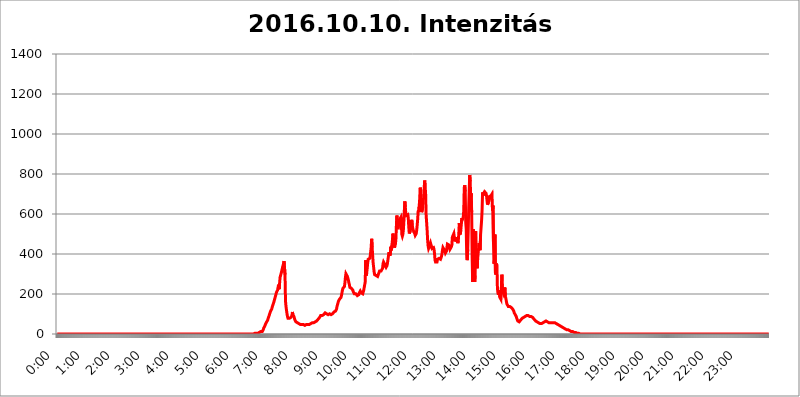
| Category | 2016.10.10. Intenzitás [W/m^2] |
|---|---|
| 0.0 | 0 |
| 0.0006944444444444445 | 0 |
| 0.001388888888888889 | 0 |
| 0.0020833333333333333 | 0 |
| 0.002777777777777778 | 0 |
| 0.003472222222222222 | 0 |
| 0.004166666666666667 | 0 |
| 0.004861111111111111 | 0 |
| 0.005555555555555556 | 0 |
| 0.0062499999999999995 | 0 |
| 0.006944444444444444 | 0 |
| 0.007638888888888889 | 0 |
| 0.008333333333333333 | 0 |
| 0.009027777777777779 | 0 |
| 0.009722222222222222 | 0 |
| 0.010416666666666666 | 0 |
| 0.011111111111111112 | 0 |
| 0.011805555555555555 | 0 |
| 0.012499999999999999 | 0 |
| 0.013194444444444444 | 0 |
| 0.013888888888888888 | 0 |
| 0.014583333333333332 | 0 |
| 0.015277777777777777 | 0 |
| 0.015972222222222224 | 0 |
| 0.016666666666666666 | 0 |
| 0.017361111111111112 | 0 |
| 0.018055555555555557 | 0 |
| 0.01875 | 0 |
| 0.019444444444444445 | 0 |
| 0.02013888888888889 | 0 |
| 0.020833333333333332 | 0 |
| 0.02152777777777778 | 0 |
| 0.022222222222222223 | 0 |
| 0.02291666666666667 | 0 |
| 0.02361111111111111 | 0 |
| 0.024305555555555556 | 0 |
| 0.024999999999999998 | 0 |
| 0.025694444444444447 | 0 |
| 0.02638888888888889 | 0 |
| 0.027083333333333334 | 0 |
| 0.027777777777777776 | 0 |
| 0.02847222222222222 | 0 |
| 0.029166666666666664 | 0 |
| 0.029861111111111113 | 0 |
| 0.030555555555555555 | 0 |
| 0.03125 | 0 |
| 0.03194444444444445 | 0 |
| 0.03263888888888889 | 0 |
| 0.03333333333333333 | 0 |
| 0.034027777777777775 | 0 |
| 0.034722222222222224 | 0 |
| 0.035416666666666666 | 0 |
| 0.036111111111111115 | 0 |
| 0.03680555555555556 | 0 |
| 0.0375 | 0 |
| 0.03819444444444444 | 0 |
| 0.03888888888888889 | 0 |
| 0.03958333333333333 | 0 |
| 0.04027777777777778 | 0 |
| 0.04097222222222222 | 0 |
| 0.041666666666666664 | 0 |
| 0.042361111111111106 | 0 |
| 0.04305555555555556 | 0 |
| 0.043750000000000004 | 0 |
| 0.044444444444444446 | 0 |
| 0.04513888888888889 | 0 |
| 0.04583333333333334 | 0 |
| 0.04652777777777778 | 0 |
| 0.04722222222222222 | 0 |
| 0.04791666666666666 | 0 |
| 0.04861111111111111 | 0 |
| 0.049305555555555554 | 0 |
| 0.049999999999999996 | 0 |
| 0.05069444444444445 | 0 |
| 0.051388888888888894 | 0 |
| 0.052083333333333336 | 0 |
| 0.05277777777777778 | 0 |
| 0.05347222222222222 | 0 |
| 0.05416666666666667 | 0 |
| 0.05486111111111111 | 0 |
| 0.05555555555555555 | 0 |
| 0.05625 | 0 |
| 0.05694444444444444 | 0 |
| 0.057638888888888885 | 0 |
| 0.05833333333333333 | 0 |
| 0.05902777777777778 | 0 |
| 0.059722222222222225 | 0 |
| 0.06041666666666667 | 0 |
| 0.061111111111111116 | 0 |
| 0.06180555555555556 | 0 |
| 0.0625 | 0 |
| 0.06319444444444444 | 0 |
| 0.06388888888888888 | 0 |
| 0.06458333333333334 | 0 |
| 0.06527777777777778 | 0 |
| 0.06597222222222222 | 0 |
| 0.06666666666666667 | 0 |
| 0.06736111111111111 | 0 |
| 0.06805555555555555 | 0 |
| 0.06874999999999999 | 0 |
| 0.06944444444444443 | 0 |
| 0.07013888888888889 | 0 |
| 0.07083333333333333 | 0 |
| 0.07152777777777779 | 0 |
| 0.07222222222222223 | 0 |
| 0.07291666666666667 | 0 |
| 0.07361111111111111 | 0 |
| 0.07430555555555556 | 0 |
| 0.075 | 0 |
| 0.07569444444444444 | 0 |
| 0.0763888888888889 | 0 |
| 0.07708333333333334 | 0 |
| 0.07777777777777778 | 0 |
| 0.07847222222222222 | 0 |
| 0.07916666666666666 | 0 |
| 0.0798611111111111 | 0 |
| 0.08055555555555556 | 0 |
| 0.08125 | 0 |
| 0.08194444444444444 | 0 |
| 0.08263888888888889 | 0 |
| 0.08333333333333333 | 0 |
| 0.08402777777777777 | 0 |
| 0.08472222222222221 | 0 |
| 0.08541666666666665 | 0 |
| 0.08611111111111112 | 0 |
| 0.08680555555555557 | 0 |
| 0.08750000000000001 | 0 |
| 0.08819444444444445 | 0 |
| 0.08888888888888889 | 0 |
| 0.08958333333333333 | 0 |
| 0.09027777777777778 | 0 |
| 0.09097222222222222 | 0 |
| 0.09166666666666667 | 0 |
| 0.09236111111111112 | 0 |
| 0.09305555555555556 | 0 |
| 0.09375 | 0 |
| 0.09444444444444444 | 0 |
| 0.09513888888888888 | 0 |
| 0.09583333333333333 | 0 |
| 0.09652777777777777 | 0 |
| 0.09722222222222222 | 0 |
| 0.09791666666666667 | 0 |
| 0.09861111111111111 | 0 |
| 0.09930555555555555 | 0 |
| 0.09999999999999999 | 0 |
| 0.10069444444444443 | 0 |
| 0.1013888888888889 | 0 |
| 0.10208333333333335 | 0 |
| 0.10277777777777779 | 0 |
| 0.10347222222222223 | 0 |
| 0.10416666666666667 | 0 |
| 0.10486111111111111 | 0 |
| 0.10555555555555556 | 0 |
| 0.10625 | 0 |
| 0.10694444444444444 | 0 |
| 0.1076388888888889 | 0 |
| 0.10833333333333334 | 0 |
| 0.10902777777777778 | 0 |
| 0.10972222222222222 | 0 |
| 0.1111111111111111 | 0 |
| 0.11180555555555556 | 0 |
| 0.11180555555555556 | 0 |
| 0.1125 | 0 |
| 0.11319444444444444 | 0 |
| 0.11388888888888889 | 0 |
| 0.11458333333333333 | 0 |
| 0.11527777777777777 | 0 |
| 0.11597222222222221 | 0 |
| 0.11666666666666665 | 0 |
| 0.1173611111111111 | 0 |
| 0.11805555555555557 | 0 |
| 0.11944444444444445 | 0 |
| 0.12013888888888889 | 0 |
| 0.12083333333333333 | 0 |
| 0.12152777777777778 | 0 |
| 0.12222222222222223 | 0 |
| 0.12291666666666667 | 0 |
| 0.12291666666666667 | 0 |
| 0.12361111111111112 | 0 |
| 0.12430555555555556 | 0 |
| 0.125 | 0 |
| 0.12569444444444444 | 0 |
| 0.12638888888888888 | 0 |
| 0.12708333333333333 | 0 |
| 0.16875 | 0 |
| 0.12847222222222224 | 0 |
| 0.12916666666666668 | 0 |
| 0.12986111111111112 | 0 |
| 0.13055555555555556 | 0 |
| 0.13125 | 0 |
| 0.13194444444444445 | 0 |
| 0.1326388888888889 | 0 |
| 0.13333333333333333 | 0 |
| 0.13402777777777777 | 0 |
| 0.13402777777777777 | 0 |
| 0.13472222222222222 | 0 |
| 0.13541666666666666 | 0 |
| 0.1361111111111111 | 0 |
| 0.13749999999999998 | 0 |
| 0.13819444444444443 | 0 |
| 0.1388888888888889 | 0 |
| 0.13958333333333334 | 0 |
| 0.14027777777777778 | 0 |
| 0.14097222222222222 | 0 |
| 0.14166666666666666 | 0 |
| 0.1423611111111111 | 0 |
| 0.14305555555555557 | 0 |
| 0.14375000000000002 | 0 |
| 0.14444444444444446 | 0 |
| 0.1451388888888889 | 0 |
| 0.1451388888888889 | 0 |
| 0.14652777777777778 | 0 |
| 0.14722222222222223 | 0 |
| 0.14791666666666667 | 0 |
| 0.1486111111111111 | 0 |
| 0.14930555555555555 | 0 |
| 0.15 | 0 |
| 0.15069444444444444 | 0 |
| 0.15138888888888888 | 0 |
| 0.15208333333333332 | 0 |
| 0.15277777777777776 | 0 |
| 0.15347222222222223 | 0 |
| 0.15416666666666667 | 0 |
| 0.15486111111111112 | 0 |
| 0.15555555555555556 | 0 |
| 0.15625 | 0 |
| 0.15694444444444444 | 0 |
| 0.15763888888888888 | 0 |
| 0.15833333333333333 | 0 |
| 0.15902777777777777 | 0 |
| 0.15972222222222224 | 0 |
| 0.16041666666666668 | 0 |
| 0.16111111111111112 | 0 |
| 0.16180555555555556 | 0 |
| 0.1625 | 0 |
| 0.16319444444444445 | 0 |
| 0.1638888888888889 | 0 |
| 0.16458333333333333 | 0 |
| 0.16527777777777777 | 0 |
| 0.16597222222222222 | 0 |
| 0.16666666666666666 | 0 |
| 0.1673611111111111 | 0 |
| 0.16805555555555554 | 0 |
| 0.16874999999999998 | 0 |
| 0.16944444444444443 | 0 |
| 0.17013888888888887 | 0 |
| 0.1708333333333333 | 0 |
| 0.17152777777777775 | 0 |
| 0.17222222222222225 | 0 |
| 0.1729166666666667 | 0 |
| 0.17361111111111113 | 0 |
| 0.17430555555555557 | 0 |
| 0.17500000000000002 | 0 |
| 0.17569444444444446 | 0 |
| 0.1763888888888889 | 0 |
| 0.17708333333333334 | 0 |
| 0.17777777777777778 | 0 |
| 0.17847222222222223 | 0 |
| 0.17916666666666667 | 0 |
| 0.1798611111111111 | 0 |
| 0.18055555555555555 | 0 |
| 0.18125 | 0 |
| 0.18194444444444444 | 0 |
| 0.1826388888888889 | 0 |
| 0.18333333333333335 | 0 |
| 0.1840277777777778 | 0 |
| 0.18472222222222223 | 0 |
| 0.18541666666666667 | 0 |
| 0.18611111111111112 | 0 |
| 0.18680555555555556 | 0 |
| 0.1875 | 0 |
| 0.18819444444444444 | 0 |
| 0.18888888888888888 | 0 |
| 0.18958333333333333 | 0 |
| 0.19027777777777777 | 0 |
| 0.1909722222222222 | 0 |
| 0.19166666666666665 | 0 |
| 0.19236111111111112 | 0 |
| 0.19305555555555554 | 0 |
| 0.19375 | 0 |
| 0.19444444444444445 | 0 |
| 0.1951388888888889 | 0 |
| 0.19583333333333333 | 0 |
| 0.19652777777777777 | 0 |
| 0.19722222222222222 | 0 |
| 0.19791666666666666 | 0 |
| 0.1986111111111111 | 0 |
| 0.19930555555555554 | 0 |
| 0.19999999999999998 | 0 |
| 0.20069444444444443 | 0 |
| 0.20138888888888887 | 0 |
| 0.2020833333333333 | 0 |
| 0.2027777777777778 | 0 |
| 0.2034722222222222 | 0 |
| 0.2041666666666667 | 0 |
| 0.20486111111111113 | 0 |
| 0.20555555555555557 | 0 |
| 0.20625000000000002 | 0 |
| 0.20694444444444446 | 0 |
| 0.2076388888888889 | 0 |
| 0.20833333333333334 | 0 |
| 0.20902777777777778 | 0 |
| 0.20972222222222223 | 0 |
| 0.21041666666666667 | 0 |
| 0.2111111111111111 | 0 |
| 0.21180555555555555 | 0 |
| 0.2125 | 0 |
| 0.21319444444444444 | 0 |
| 0.2138888888888889 | 0 |
| 0.21458333333333335 | 0 |
| 0.2152777777777778 | 0 |
| 0.21597222222222223 | 0 |
| 0.21666666666666667 | 0 |
| 0.21736111111111112 | 0 |
| 0.21805555555555556 | 0 |
| 0.21875 | 0 |
| 0.21944444444444444 | 0 |
| 0.22013888888888888 | 0 |
| 0.22083333333333333 | 0 |
| 0.22152777777777777 | 0 |
| 0.2222222222222222 | 0 |
| 0.22291666666666665 | 0 |
| 0.2236111111111111 | 0 |
| 0.22430555555555556 | 0 |
| 0.225 | 0 |
| 0.22569444444444445 | 0 |
| 0.2263888888888889 | 0 |
| 0.22708333333333333 | 0 |
| 0.22777777777777777 | 0 |
| 0.22847222222222222 | 0 |
| 0.22916666666666666 | 0 |
| 0.2298611111111111 | 0 |
| 0.23055555555555554 | 0 |
| 0.23124999999999998 | 0 |
| 0.23194444444444443 | 0 |
| 0.23263888888888887 | 0 |
| 0.2333333333333333 | 0 |
| 0.2340277777777778 | 0 |
| 0.2347222222222222 | 0 |
| 0.2354166666666667 | 0 |
| 0.23611111111111113 | 0 |
| 0.23680555555555557 | 0 |
| 0.23750000000000002 | 0 |
| 0.23819444444444446 | 0 |
| 0.2388888888888889 | 0 |
| 0.23958333333333334 | 0 |
| 0.24027777777777778 | 0 |
| 0.24097222222222223 | 0 |
| 0.24166666666666667 | 0 |
| 0.2423611111111111 | 0 |
| 0.24305555555555555 | 0 |
| 0.24375 | 0 |
| 0.24444444444444446 | 0 |
| 0.24513888888888888 | 0 |
| 0.24583333333333335 | 0 |
| 0.2465277777777778 | 0 |
| 0.24722222222222223 | 0 |
| 0.24791666666666667 | 0 |
| 0.24861111111111112 | 0 |
| 0.24930555555555556 | 0 |
| 0.25 | 0 |
| 0.25069444444444444 | 0 |
| 0.2513888888888889 | 0 |
| 0.2520833333333333 | 0 |
| 0.25277777777777777 | 0 |
| 0.2534722222222222 | 0 |
| 0.25416666666666665 | 0 |
| 0.2548611111111111 | 0 |
| 0.2555555555555556 | 0 |
| 0.25625000000000003 | 0 |
| 0.2569444444444445 | 0 |
| 0.2576388888888889 | 0 |
| 0.25833333333333336 | 0 |
| 0.2590277777777778 | 0 |
| 0.25972222222222224 | 0 |
| 0.2604166666666667 | 0 |
| 0.2611111111111111 | 0 |
| 0.26180555555555557 | 0 |
| 0.2625 | 0 |
| 0.26319444444444445 | 0 |
| 0.2638888888888889 | 0 |
| 0.26458333333333334 | 0 |
| 0.2652777777777778 | 0 |
| 0.2659722222222222 | 0 |
| 0.26666666666666666 | 0 |
| 0.2673611111111111 | 0 |
| 0.26805555555555555 | 0 |
| 0.26875 | 0 |
| 0.26944444444444443 | 0 |
| 0.2701388888888889 | 0 |
| 0.2708333333333333 | 0 |
| 0.27152777777777776 | 0 |
| 0.2722222222222222 | 0 |
| 0.27291666666666664 | 0 |
| 0.2736111111111111 | 0 |
| 0.2743055555555555 | 0 |
| 0.27499999999999997 | 0 |
| 0.27569444444444446 | 3.525 |
| 0.27638888888888885 | 3.525 |
| 0.27708333333333335 | 3.525 |
| 0.2777777777777778 | 3.525 |
| 0.27847222222222223 | 3.525 |
| 0.2791666666666667 | 3.525 |
| 0.2798611111111111 | 3.525 |
| 0.28055555555555556 | 3.525 |
| 0.28125 | 3.525 |
| 0.28194444444444444 | 7.887 |
| 0.2826388888888889 | 7.887 |
| 0.2833333333333333 | 7.887 |
| 0.28402777777777777 | 12.257 |
| 0.2847222222222222 | 12.257 |
| 0.28541666666666665 | 12.257 |
| 0.28611111111111115 | 12.257 |
| 0.28680555555555554 | 12.257 |
| 0.28750000000000003 | 12.257 |
| 0.2881944444444445 | 16.636 |
| 0.2888888888888889 | 21.024 |
| 0.28958333333333336 | 29.823 |
| 0.2902777777777778 | 34.234 |
| 0.29097222222222224 | 38.653 |
| 0.2916666666666667 | 43.079 |
| 0.2923611111111111 | 51.951 |
| 0.29305555555555557 | 56.398 |
| 0.29375 | 60.85 |
| 0.29444444444444445 | 65.31 |
| 0.2951388888888889 | 69.775 |
| 0.29583333333333334 | 78.722 |
| 0.2965277777777778 | 83.205 |
| 0.2972222222222222 | 92.184 |
| 0.29791666666666666 | 101.184 |
| 0.2986111111111111 | 105.69 |
| 0.29930555555555555 | 114.716 |
| 0.3 | 119.235 |
| 0.30069444444444443 | 123.758 |
| 0.3013888888888889 | 132.814 |
| 0.3020833333333333 | 141.884 |
| 0.30277777777777776 | 146.423 |
| 0.3034722222222222 | 155.509 |
| 0.30416666666666664 | 164.605 |
| 0.3048611111111111 | 173.709 |
| 0.3055555555555555 | 182.82 |
| 0.30624999999999997 | 191.937 |
| 0.3069444444444444 | 201.058 |
| 0.3076388888888889 | 210.182 |
| 0.30833333333333335 | 214.746 |
| 0.3090277777777778 | 219.309 |
| 0.30972222222222223 | 233 |
| 0.3104166666666667 | 246.689 |
| 0.3111111111111111 | 223.873 |
| 0.31180555555555556 | 251.251 |
| 0.3125 | 283.156 |
| 0.31319444444444444 | 292.259 |
| 0.3138888888888889 | 301.354 |
| 0.3145833333333333 | 310.44 |
| 0.31527777777777777 | 314.98 |
| 0.3159722222222222 | 333.113 |
| 0.31666666666666665 | 342.162 |
| 0.31736111111111115 | 351.198 |
| 0.31805555555555554 | 364.728 |
| 0.31875000000000003 | 360.221 |
| 0.3194444444444445 | 296.808 |
| 0.3201388888888889 | 164.605 |
| 0.32083333333333336 | 137.347 |
| 0.3215277777777778 | 141.884 |
| 0.32222222222222224 | 101.184 |
| 0.3229166666666667 | 87.692 |
| 0.3236111111111111 | 78.722 |
| 0.32430555555555557 | 78.722 |
| 0.325 | 78.722 |
| 0.32569444444444445 | 78.722 |
| 0.3263888888888889 | 78.722 |
| 0.32708333333333334 | 83.205 |
| 0.3277777777777778 | 83.205 |
| 0.3284722222222222 | 87.692 |
| 0.32916666666666666 | 92.184 |
| 0.3298611111111111 | 110.201 |
| 0.33055555555555555 | 96.682 |
| 0.33125 | 101.184 |
| 0.33194444444444443 | 87.692 |
| 0.3326388888888889 | 78.722 |
| 0.3333333333333333 | 69.775 |
| 0.3340277777777778 | 65.31 |
| 0.3347222222222222 | 60.85 |
| 0.3354166666666667 | 60.85 |
| 0.3361111111111111 | 60.85 |
| 0.3368055555555556 | 56.398 |
| 0.33749999999999997 | 56.398 |
| 0.33819444444444446 | 56.398 |
| 0.33888888888888885 | 51.951 |
| 0.33958333333333335 | 51.951 |
| 0.34027777777777773 | 47.511 |
| 0.34097222222222223 | 47.511 |
| 0.3416666666666666 | 47.511 |
| 0.3423611111111111 | 47.511 |
| 0.3430555555555555 | 47.511 |
| 0.34375 | 47.511 |
| 0.3444444444444445 | 47.511 |
| 0.3451388888888889 | 47.511 |
| 0.3458333333333334 | 47.511 |
| 0.34652777777777777 | 47.511 |
| 0.34722222222222227 | 43.079 |
| 0.34791666666666665 | 43.079 |
| 0.34861111111111115 | 43.079 |
| 0.34930555555555554 | 47.511 |
| 0.35000000000000003 | 47.511 |
| 0.3506944444444444 | 47.511 |
| 0.3513888888888889 | 47.511 |
| 0.3520833333333333 | 47.511 |
| 0.3527777777777778 | 47.511 |
| 0.3534722222222222 | 47.511 |
| 0.3541666666666667 | 47.511 |
| 0.3548611111111111 | 51.951 |
| 0.35555555555555557 | 51.951 |
| 0.35625 | 51.951 |
| 0.35694444444444445 | 51.951 |
| 0.3576388888888889 | 56.398 |
| 0.35833333333333334 | 56.398 |
| 0.3590277777777778 | 56.398 |
| 0.3597222222222222 | 56.398 |
| 0.36041666666666666 | 56.398 |
| 0.3611111111111111 | 60.85 |
| 0.36180555555555555 | 60.85 |
| 0.3625 | 60.85 |
| 0.36319444444444443 | 65.31 |
| 0.3638888888888889 | 65.31 |
| 0.3645833333333333 | 65.31 |
| 0.3652777777777778 | 69.775 |
| 0.3659722222222222 | 74.246 |
| 0.3666666666666667 | 74.246 |
| 0.3673611111111111 | 78.722 |
| 0.3680555555555556 | 83.205 |
| 0.36874999999999997 | 87.692 |
| 0.36944444444444446 | 92.184 |
| 0.37013888888888885 | 92.184 |
| 0.37083333333333335 | 92.184 |
| 0.37152777777777773 | 92.184 |
| 0.37222222222222223 | 96.682 |
| 0.3729166666666666 | 96.682 |
| 0.3736111111111111 | 96.682 |
| 0.3743055555555555 | 101.184 |
| 0.375 | 101.184 |
| 0.3756944444444445 | 105.69 |
| 0.3763888888888889 | 101.184 |
| 0.3770833333333334 | 101.184 |
| 0.37777777777777777 | 101.184 |
| 0.37847222222222227 | 96.682 |
| 0.37916666666666665 | 96.682 |
| 0.37986111111111115 | 96.682 |
| 0.38055555555555554 | 101.184 |
| 0.38125000000000003 | 101.184 |
| 0.3819444444444444 | 101.184 |
| 0.3826388888888889 | 101.184 |
| 0.3833333333333333 | 101.184 |
| 0.3840277777777778 | 96.682 |
| 0.3847222222222222 | 96.682 |
| 0.3854166666666667 | 96.682 |
| 0.3861111111111111 | 101.184 |
| 0.38680555555555557 | 101.184 |
| 0.3875 | 105.69 |
| 0.38819444444444445 | 110.201 |
| 0.3888888888888889 | 110.201 |
| 0.38958333333333334 | 110.201 |
| 0.3902777777777778 | 114.716 |
| 0.3909722222222222 | 119.235 |
| 0.39166666666666666 | 123.758 |
| 0.3923611111111111 | 137.347 |
| 0.39305555555555555 | 146.423 |
| 0.39375 | 155.509 |
| 0.39444444444444443 | 164.605 |
| 0.3951388888888889 | 169.156 |
| 0.3958333333333333 | 173.709 |
| 0.3965277777777778 | 173.709 |
| 0.3972222222222222 | 173.709 |
| 0.3979166666666667 | 182.82 |
| 0.3986111111111111 | 191.937 |
| 0.3993055555555556 | 205.62 |
| 0.39999999999999997 | 219.309 |
| 0.40069444444444446 | 228.436 |
| 0.40138888888888885 | 228.436 |
| 0.40208333333333335 | 228.436 |
| 0.40277777777777773 | 237.564 |
| 0.40347222222222223 | 255.813 |
| 0.4041666666666666 | 283.156 |
| 0.4048611111111111 | 301.354 |
| 0.4055555555555555 | 305.898 |
| 0.40625 | 296.808 |
| 0.4069444444444445 | 287.709 |
| 0.4076388888888889 | 278.603 |
| 0.4083333333333334 | 269.49 |
| 0.40902777777777777 | 255.813 |
| 0.40972222222222227 | 246.689 |
| 0.41041666666666665 | 233 |
| 0.41111111111111115 | 228.436 |
| 0.41180555555555554 | 228.436 |
| 0.41250000000000003 | 228.436 |
| 0.4131944444444444 | 228.436 |
| 0.4138888888888889 | 223.873 |
| 0.4145833333333333 | 219.309 |
| 0.4152777777777778 | 210.182 |
| 0.4159722222222222 | 205.62 |
| 0.4166666666666667 | 201.058 |
| 0.4173611111111111 | 201.058 |
| 0.41805555555555557 | 201.058 |
| 0.41875 | 201.058 |
| 0.41944444444444445 | 201.058 |
| 0.4201388888888889 | 196.497 |
| 0.42083333333333334 | 191.937 |
| 0.4215277777777778 | 191.937 |
| 0.4222222222222222 | 191.937 |
| 0.42291666666666666 | 196.497 |
| 0.4236111111111111 | 205.62 |
| 0.42430555555555555 | 210.182 |
| 0.425 | 214.746 |
| 0.42569444444444443 | 210.182 |
| 0.4263888888888889 | 205.62 |
| 0.4270833333333333 | 201.058 |
| 0.4277777777777778 | 201.058 |
| 0.4284722222222222 | 201.058 |
| 0.4291666666666667 | 210.182 |
| 0.4298611111111111 | 219.309 |
| 0.4305555555555556 | 233 |
| 0.43124999999999997 | 246.689 |
| 0.43194444444444446 | 260.373 |
| 0.43263888888888885 | 369.23 |
| 0.43333333333333335 | 292.259 |
| 0.43402777777777773 | 305.898 |
| 0.43472222222222223 | 328.584 |
| 0.4354166666666666 | 355.712 |
| 0.4361111111111111 | 373.729 |
| 0.4368055555555555 | 378.224 |
| 0.4375 | 373.729 |
| 0.4381944444444445 | 378.224 |
| 0.4388888888888889 | 387.202 |
| 0.4395833333333334 | 409.574 |
| 0.44027777777777777 | 431.833 |
| 0.44097222222222227 | 475.972 |
| 0.44166666666666665 | 436.27 |
| 0.44236111111111115 | 391.685 |
| 0.44305555555555554 | 355.712 |
| 0.44375000000000003 | 333.113 |
| 0.4444444444444444 | 310.44 |
| 0.4451388888888889 | 296.808 |
| 0.4458333333333333 | 292.259 |
| 0.4465277777777778 | 292.259 |
| 0.4472222222222222 | 292.259 |
| 0.4479166666666667 | 292.259 |
| 0.4486111111111111 | 287.709 |
| 0.44930555555555557 | 287.709 |
| 0.45 | 292.259 |
| 0.45069444444444445 | 301.354 |
| 0.4513888888888889 | 305.898 |
| 0.45208333333333334 | 314.98 |
| 0.4527777777777778 | 319.517 |
| 0.4534722222222222 | 319.517 |
| 0.45416666666666666 | 314.98 |
| 0.4548611111111111 | 310.44 |
| 0.45555555555555555 | 314.98 |
| 0.45625 | 328.584 |
| 0.45694444444444443 | 351.198 |
| 0.4576388888888889 | 360.221 |
| 0.4583333333333333 | 360.221 |
| 0.4590277777777778 | 351.198 |
| 0.4597222222222222 | 342.162 |
| 0.4604166666666667 | 337.639 |
| 0.4611111111111111 | 333.113 |
| 0.4618055555555556 | 333.113 |
| 0.46249999999999997 | 342.162 |
| 0.46319444444444446 | 355.712 |
| 0.46388888888888885 | 373.729 |
| 0.46458333333333335 | 391.685 |
| 0.46527777777777773 | 409.574 |
| 0.46597222222222223 | 405.108 |
| 0.4666666666666666 | 391.685 |
| 0.4673611111111111 | 387.202 |
| 0.4680555555555555 | 436.27 |
| 0.46875 | 418.492 |
| 0.4694444444444445 | 445.129 |
| 0.4701388888888889 | 471.582 |
| 0.4708333333333334 | 502.192 |
| 0.47152777777777777 | 506.542 |
| 0.47222222222222227 | 453.968 |
| 0.47291666666666665 | 431.833 |
| 0.47361111111111115 | 440.702 |
| 0.47430555555555554 | 449.551 |
| 0.47500000000000003 | 475.972 |
| 0.4756944444444444 | 545.416 |
| 0.4763888888888889 | 592.233 |
| 0.4770833333333333 | 532.513 |
| 0.4777777777777778 | 523.88 |
| 0.4784722222222222 | 519.555 |
| 0.4791666666666667 | 523.88 |
| 0.4798611111111111 | 571.049 |
| 0.48055555555555557 | 571.049 |
| 0.48125 | 566.793 |
| 0.48194444444444445 | 583.779 |
| 0.4826388888888889 | 541.121 |
| 0.48333333333333334 | 497.836 |
| 0.4840277777777778 | 489.108 |
| 0.4847222222222222 | 497.836 |
| 0.48541666666666666 | 519.555 |
| 0.4861111111111111 | 558.261 |
| 0.48680555555555555 | 617.436 |
| 0.4875 | 663.019 |
| 0.48819444444444443 | 634.105 |
| 0.4888888888888889 | 600.661 |
| 0.4895833333333333 | 592.233 |
| 0.4902777777777778 | 596.45 |
| 0.4909722222222222 | 592.233 |
| 0.4916666666666667 | 596.45 |
| 0.4923611111111111 | 579.542 |
| 0.4930555555555556 | 532.513 |
| 0.49374999999999997 | 502.192 |
| 0.49444444444444446 | 502.192 |
| 0.49513888888888885 | 515.223 |
| 0.49583333333333335 | 532.513 |
| 0.49652777777777773 | 553.986 |
| 0.49722222222222223 | 571.049 |
| 0.4979166666666666 | 545.416 |
| 0.4986111111111111 | 528.2 |
| 0.4993055555555555 | 519.555 |
| 0.5 | 510.885 |
| 0.5006944444444444 | 510.885 |
| 0.5013888888888889 | 502.192 |
| 0.5020833333333333 | 493.475 |
| 0.5027777777777778 | 489.108 |
| 0.5034722222222222 | 502.192 |
| 0.5041666666666667 | 519.555 |
| 0.5048611111111111 | 545.416 |
| 0.5055555555555555 | 575.299 |
| 0.50625 | 617.436 |
| 0.5069444444444444 | 609.062 |
| 0.5076388888888889 | 638.256 |
| 0.5083333333333333 | 675.311 |
| 0.5090277777777777 | 731.896 |
| 0.5097222222222222 | 719.877 |
| 0.5104166666666666 | 663.019 |
| 0.5111111111111112 | 609.062 |
| 0.5118055555555555 | 604.864 |
| 0.5125000000000001 | 629.948 |
| 0.5131944444444444 | 671.22 |
| 0.513888888888889 | 679.395 |
| 0.5145833333333333 | 683.473 |
| 0.5152777777777778 | 767.62 |
| 0.5159722222222222 | 739.877 |
| 0.5166666666666667 | 699.717 |
| 0.517361111111111 | 596.45 |
| 0.5180555555555556 | 558.261 |
| 0.5187499999999999 | 519.555 |
| 0.5194444444444445 | 471.582 |
| 0.5201388888888888 | 440.702 |
| 0.5208333333333334 | 427.39 |
| 0.5215277777777778 | 422.943 |
| 0.5222222222222223 | 431.833 |
| 0.5229166666666667 | 445.129 |
| 0.5236111111111111 | 453.968 |
| 0.5243055555555556 | 458.38 |
| 0.525 | 436.27 |
| 0.5256944444444445 | 427.39 |
| 0.5263888888888889 | 422.943 |
| 0.5270833333333333 | 427.39 |
| 0.5277777777777778 | 431.833 |
| 0.5284722222222222 | 422.943 |
| 0.5291666666666667 | 400.638 |
| 0.5298611111111111 | 369.23 |
| 0.5305555555555556 | 360.221 |
| 0.53125 | 355.712 |
| 0.5319444444444444 | 355.712 |
| 0.5326388888888889 | 360.221 |
| 0.5333333333333333 | 373.729 |
| 0.5340277777777778 | 373.729 |
| 0.5347222222222222 | 378.224 |
| 0.5354166666666667 | 378.224 |
| 0.5361111111111111 | 378.224 |
| 0.5368055555555555 | 373.729 |
| 0.5375 | 373.729 |
| 0.5381944444444444 | 378.224 |
| 0.5388888888888889 | 387.202 |
| 0.5395833333333333 | 400.638 |
| 0.5402777777777777 | 418.492 |
| 0.5409722222222222 | 431.833 |
| 0.5416666666666666 | 431.833 |
| 0.5423611111111112 | 422.943 |
| 0.5430555555555555 | 418.492 |
| 0.5437500000000001 | 414.035 |
| 0.5444444444444444 | 405.108 |
| 0.545138888888889 | 405.108 |
| 0.5458333333333333 | 414.035 |
| 0.5465277777777778 | 431.833 |
| 0.5472222222222222 | 449.551 |
| 0.5479166666666667 | 453.968 |
| 0.548611111111111 | 449.551 |
| 0.5493055555555556 | 445.129 |
| 0.5499999999999999 | 431.833 |
| 0.5506944444444445 | 422.943 |
| 0.5513888888888888 | 422.943 |
| 0.5520833333333334 | 427.39 |
| 0.5527777777777778 | 436.27 |
| 0.5534722222222223 | 445.129 |
| 0.5541666666666667 | 484.735 |
| 0.5548611111111111 | 484.735 |
| 0.5555555555555556 | 484.735 |
| 0.55625 | 502.192 |
| 0.5569444444444445 | 502.192 |
| 0.5576388888888889 | 462.786 |
| 0.5583333333333333 | 462.786 |
| 0.5590277777777778 | 475.972 |
| 0.5597222222222222 | 484.735 |
| 0.5604166666666667 | 471.582 |
| 0.5611111111111111 | 462.786 |
| 0.5618055555555556 | 453.968 |
| 0.5625 | 467.187 |
| 0.5631944444444444 | 502.192 |
| 0.5638888888888889 | 553.986 |
| 0.5645833333333333 | 558.261 |
| 0.5652777777777778 | 497.836 |
| 0.5659722222222222 | 519.555 |
| 0.5666666666666667 | 545.416 |
| 0.5673611111111111 | 579.542 |
| 0.5680555555555555 | 571.049 |
| 0.56875 | 575.299 |
| 0.5694444444444444 | 583.779 |
| 0.5701388888888889 | 617.436 |
| 0.5708333333333333 | 731.896 |
| 0.5715277777777777 | 743.859 |
| 0.5722222222222222 | 711.832 |
| 0.5729166666666666 | 558.261 |
| 0.5736111111111112 | 523.88 |
| 0.5743055555555555 | 391.685 |
| 0.5750000000000001 | 369.23 |
| 0.5756944444444444 | 422.943 |
| 0.576388888888889 | 515.223 |
| 0.5770833333333333 | 629.948 |
| 0.5777777777777778 | 634.105 |
| 0.5784722222222222 | 795.074 |
| 0.5791666666666667 | 763.674 |
| 0.579861111111111 | 687.544 |
| 0.5805555555555556 | 703.762 |
| 0.5812499999999999 | 609.062 |
| 0.5819444444444445 | 378.224 |
| 0.5826388888888888 | 260.373 |
| 0.5833333333333334 | 523.88 |
| 0.5840277777777778 | 369.23 |
| 0.5847222222222223 | 414.035 |
| 0.5854166666666667 | 260.373 |
| 0.5861111111111111 | 292.259 |
| 0.5868055555555556 | 515.223 |
| 0.5875 | 360.221 |
| 0.5881944444444445 | 391.685 |
| 0.5888888888888889 | 328.584 |
| 0.5895833333333333 | 369.23 |
| 0.5902777777777778 | 405.108 |
| 0.5909722222222222 | 427.39 |
| 0.5916666666666667 | 453.968 |
| 0.5923611111111111 | 427.39 |
| 0.5930555555555556 | 418.492 |
| 0.59375 | 497.836 |
| 0.5944444444444444 | 497.836 |
| 0.5951388888888889 | 566.793 |
| 0.5958333333333333 | 617.436 |
| 0.5965277777777778 | 707.8 |
| 0.5972222222222222 | 691.608 |
| 0.5979166666666667 | 703.762 |
| 0.5986111111111111 | 707.8 |
| 0.5993055555555555 | 711.832 |
| 0.6 | 707.8 |
| 0.6006944444444444 | 707.8 |
| 0.6013888888888889 | 703.762 |
| 0.6020833333333333 | 691.608 |
| 0.6027777777777777 | 667.123 |
| 0.6034722222222222 | 646.537 |
| 0.6041666666666666 | 650.667 |
| 0.6048611111111112 | 658.909 |
| 0.6055555555555555 | 667.123 |
| 0.6062500000000001 | 687.544 |
| 0.6069444444444444 | 691.608 |
| 0.607638888888889 | 691.608 |
| 0.6083333333333333 | 691.608 |
| 0.6090277777777778 | 695.666 |
| 0.6097222222222222 | 699.717 |
| 0.6104166666666667 | 617.436 |
| 0.611111111111111 | 642.4 |
| 0.6118055555555556 | 462.786 |
| 0.6124999999999999 | 351.198 |
| 0.6131944444444445 | 369.23 |
| 0.6138888888888888 | 497.836 |
| 0.6145833333333334 | 305.898 |
| 0.6152777777777778 | 296.808 |
| 0.6159722222222223 | 351.198 |
| 0.6166666666666667 | 342.162 |
| 0.6173611111111111 | 228.436 |
| 0.6180555555555556 | 205.62 |
| 0.61875 | 196.497 |
| 0.6194444444444445 | 191.937 |
| 0.6201388888888889 | 219.309 |
| 0.6208333333333333 | 182.82 |
| 0.6215277777777778 | 182.82 |
| 0.6222222222222222 | 173.709 |
| 0.6229166666666667 | 178.264 |
| 0.6236111111111111 | 296.808 |
| 0.6243055555555556 | 205.62 |
| 0.625 | 214.746 |
| 0.6256944444444444 | 205.62 |
| 0.6263888888888889 | 210.182 |
| 0.6270833333333333 | 201.058 |
| 0.6277777777777778 | 233 |
| 0.6284722222222222 | 187.378 |
| 0.6291666666666667 | 178.264 |
| 0.6298611111111111 | 164.605 |
| 0.6305555555555555 | 150.964 |
| 0.63125 | 146.423 |
| 0.6319444444444444 | 146.423 |
| 0.6326388888888889 | 137.347 |
| 0.6333333333333333 | 141.884 |
| 0.6340277777777777 | 137.347 |
| 0.6347222222222222 | 137.347 |
| 0.6354166666666666 | 137.347 |
| 0.6361111111111112 | 137.347 |
| 0.6368055555555555 | 132.814 |
| 0.6375000000000001 | 128.284 |
| 0.6381944444444444 | 128.284 |
| 0.638888888888889 | 123.758 |
| 0.6395833333333333 | 119.235 |
| 0.6402777777777778 | 114.716 |
| 0.6409722222222222 | 105.69 |
| 0.6416666666666667 | 101.184 |
| 0.642361111111111 | 96.682 |
| 0.6430555555555556 | 92.184 |
| 0.6437499999999999 | 87.692 |
| 0.6444444444444445 | 78.722 |
| 0.6451388888888888 | 74.246 |
| 0.6458333333333334 | 65.31 |
| 0.6465277777777778 | 65.31 |
| 0.6472222222222223 | 60.85 |
| 0.6479166666666667 | 60.85 |
| 0.6486111111111111 | 65.31 |
| 0.6493055555555556 | 65.31 |
| 0.65 | 69.775 |
| 0.6506944444444445 | 74.246 |
| 0.6513888888888889 | 74.246 |
| 0.6520833333333333 | 78.722 |
| 0.6527777777777778 | 83.205 |
| 0.6534722222222222 | 83.205 |
| 0.6541666666666667 | 83.205 |
| 0.6548611111111111 | 87.692 |
| 0.6555555555555556 | 87.692 |
| 0.65625 | 87.692 |
| 0.6569444444444444 | 87.692 |
| 0.6576388888888889 | 92.184 |
| 0.6583333333333333 | 92.184 |
| 0.6590277777777778 | 92.184 |
| 0.6597222222222222 | 92.184 |
| 0.6604166666666667 | 92.184 |
| 0.6611111111111111 | 92.184 |
| 0.6618055555555555 | 87.692 |
| 0.6625 | 87.692 |
| 0.6631944444444444 | 87.692 |
| 0.6638888888888889 | 87.692 |
| 0.6645833333333333 | 87.692 |
| 0.6652777777777777 | 83.205 |
| 0.6659722222222222 | 83.205 |
| 0.6666666666666666 | 83.205 |
| 0.6673611111111111 | 83.205 |
| 0.6680555555555556 | 78.722 |
| 0.6687500000000001 | 74.246 |
| 0.6694444444444444 | 69.775 |
| 0.6701388888888888 | 69.775 |
| 0.6708333333333334 | 65.31 |
| 0.6715277777777778 | 65.31 |
| 0.6722222222222222 | 60.85 |
| 0.6729166666666666 | 60.85 |
| 0.6736111111111112 | 56.398 |
| 0.6743055555555556 | 56.398 |
| 0.6749999999999999 | 56.398 |
| 0.6756944444444444 | 51.951 |
| 0.6763888888888889 | 51.951 |
| 0.6770833333333334 | 51.951 |
| 0.6777777777777777 | 51.951 |
| 0.6784722222222223 | 51.951 |
| 0.6791666666666667 | 51.951 |
| 0.6798611111111111 | 51.951 |
| 0.6805555555555555 | 56.398 |
| 0.68125 | 56.398 |
| 0.6819444444444445 | 56.398 |
| 0.6826388888888889 | 60.85 |
| 0.6833333333333332 | 60.85 |
| 0.6840277777777778 | 65.31 |
| 0.6847222222222222 | 65.31 |
| 0.6854166666666667 | 65.31 |
| 0.686111111111111 | 65.31 |
| 0.6868055555555556 | 60.85 |
| 0.6875 | 60.85 |
| 0.6881944444444444 | 60.85 |
| 0.688888888888889 | 56.398 |
| 0.6895833333333333 | 56.398 |
| 0.6902777777777778 | 56.398 |
| 0.6909722222222222 | 56.398 |
| 0.6916666666666668 | 56.398 |
| 0.6923611111111111 | 56.398 |
| 0.6930555555555555 | 56.398 |
| 0.69375 | 56.398 |
| 0.6944444444444445 | 56.398 |
| 0.6951388888888889 | 56.398 |
| 0.6958333333333333 | 56.398 |
| 0.6965277777777777 | 56.398 |
| 0.6972222222222223 | 56.398 |
| 0.6979166666666666 | 56.398 |
| 0.6986111111111111 | 56.398 |
| 0.6993055555555556 | 51.951 |
| 0.7000000000000001 | 51.951 |
| 0.7006944444444444 | 51.951 |
| 0.7013888888888888 | 47.511 |
| 0.7020833333333334 | 47.511 |
| 0.7027777777777778 | 43.079 |
| 0.7034722222222222 | 43.079 |
| 0.7041666666666666 | 43.079 |
| 0.7048611111111112 | 38.653 |
| 0.7055555555555556 | 38.653 |
| 0.7062499999999999 | 38.653 |
| 0.7069444444444444 | 38.653 |
| 0.7076388888888889 | 34.234 |
| 0.7083333333333334 | 34.234 |
| 0.7090277777777777 | 34.234 |
| 0.7097222222222223 | 29.823 |
| 0.7104166666666667 | 29.823 |
| 0.7111111111111111 | 29.823 |
| 0.7118055555555555 | 25.419 |
| 0.7125 | 25.419 |
| 0.7131944444444445 | 25.419 |
| 0.7138888888888889 | 21.024 |
| 0.7145833333333332 | 21.024 |
| 0.7152777777777778 | 21.024 |
| 0.7159722222222222 | 21.024 |
| 0.7166666666666667 | 21.024 |
| 0.717361111111111 | 21.024 |
| 0.7180555555555556 | 16.636 |
| 0.71875 | 16.636 |
| 0.7194444444444444 | 16.636 |
| 0.720138888888889 | 16.636 |
| 0.7208333333333333 | 12.257 |
| 0.7215277777777778 | 12.257 |
| 0.7222222222222222 | 12.257 |
| 0.7229166666666668 | 12.257 |
| 0.7236111111111111 | 12.257 |
| 0.7243055555555555 | 12.257 |
| 0.725 | 7.887 |
| 0.7256944444444445 | 7.887 |
| 0.7263888888888889 | 7.887 |
| 0.7270833333333333 | 7.887 |
| 0.7277777777777777 | 7.887 |
| 0.7284722222222223 | 7.887 |
| 0.7291666666666666 | 3.525 |
| 0.7298611111111111 | 3.525 |
| 0.7305555555555556 | 3.525 |
| 0.7312500000000001 | 3.525 |
| 0.7319444444444444 | 3.525 |
| 0.7326388888888888 | 3.525 |
| 0.7333333333333334 | 0 |
| 0.7340277777777778 | 0 |
| 0.7347222222222222 | 0 |
| 0.7354166666666666 | 0 |
| 0.7361111111111112 | 0 |
| 0.7368055555555556 | 0 |
| 0.7374999999999999 | 0 |
| 0.7381944444444444 | 0 |
| 0.7388888888888889 | 0 |
| 0.7395833333333334 | 0 |
| 0.7402777777777777 | 0 |
| 0.7409722222222223 | 0 |
| 0.7416666666666667 | 0 |
| 0.7423611111111111 | 0 |
| 0.7430555555555555 | 0 |
| 0.74375 | 0 |
| 0.7444444444444445 | 0 |
| 0.7451388888888889 | 0 |
| 0.7458333333333332 | 0 |
| 0.7465277777777778 | 0 |
| 0.7472222222222222 | 0 |
| 0.7479166666666667 | 0 |
| 0.748611111111111 | 0 |
| 0.7493055555555556 | 0 |
| 0.75 | 0 |
| 0.7506944444444444 | 0 |
| 0.751388888888889 | 0 |
| 0.7520833333333333 | 0 |
| 0.7527777777777778 | 0 |
| 0.7534722222222222 | 0 |
| 0.7541666666666668 | 0 |
| 0.7548611111111111 | 0 |
| 0.7555555555555555 | 0 |
| 0.75625 | 0 |
| 0.7569444444444445 | 0 |
| 0.7576388888888889 | 0 |
| 0.7583333333333333 | 0 |
| 0.7590277777777777 | 0 |
| 0.7597222222222223 | 0 |
| 0.7604166666666666 | 0 |
| 0.7611111111111111 | 0 |
| 0.7618055555555556 | 0 |
| 0.7625000000000001 | 0 |
| 0.7631944444444444 | 0 |
| 0.7638888888888888 | 0 |
| 0.7645833333333334 | 0 |
| 0.7652777777777778 | 0 |
| 0.7659722222222222 | 0 |
| 0.7666666666666666 | 0 |
| 0.7673611111111112 | 0 |
| 0.7680555555555556 | 0 |
| 0.7687499999999999 | 0 |
| 0.7694444444444444 | 0 |
| 0.7701388888888889 | 0 |
| 0.7708333333333334 | 0 |
| 0.7715277777777777 | 0 |
| 0.7722222222222223 | 0 |
| 0.7729166666666667 | 0 |
| 0.7736111111111111 | 0 |
| 0.7743055555555555 | 0 |
| 0.775 | 0 |
| 0.7756944444444445 | 0 |
| 0.7763888888888889 | 0 |
| 0.7770833333333332 | 0 |
| 0.7777777777777778 | 0 |
| 0.7784722222222222 | 0 |
| 0.7791666666666667 | 0 |
| 0.779861111111111 | 0 |
| 0.7805555555555556 | 0 |
| 0.78125 | 0 |
| 0.7819444444444444 | 0 |
| 0.782638888888889 | 0 |
| 0.7833333333333333 | 0 |
| 0.7840277777777778 | 0 |
| 0.7847222222222222 | 0 |
| 0.7854166666666668 | 0 |
| 0.7861111111111111 | 0 |
| 0.7868055555555555 | 0 |
| 0.7875 | 0 |
| 0.7881944444444445 | 0 |
| 0.7888888888888889 | 0 |
| 0.7895833333333333 | 0 |
| 0.7902777777777777 | 0 |
| 0.7909722222222223 | 0 |
| 0.7916666666666666 | 0 |
| 0.7923611111111111 | 0 |
| 0.7930555555555556 | 0 |
| 0.7937500000000001 | 0 |
| 0.7944444444444444 | 0 |
| 0.7951388888888888 | 0 |
| 0.7958333333333334 | 0 |
| 0.7965277777777778 | 0 |
| 0.7972222222222222 | 0 |
| 0.7979166666666666 | 0 |
| 0.7986111111111112 | 0 |
| 0.7993055555555556 | 0 |
| 0.7999999999999999 | 0 |
| 0.8006944444444444 | 0 |
| 0.8013888888888889 | 0 |
| 0.8020833333333334 | 0 |
| 0.8027777777777777 | 0 |
| 0.8034722222222223 | 0 |
| 0.8041666666666667 | 0 |
| 0.8048611111111111 | 0 |
| 0.8055555555555555 | 0 |
| 0.80625 | 0 |
| 0.8069444444444445 | 0 |
| 0.8076388888888889 | 0 |
| 0.8083333333333332 | 0 |
| 0.8090277777777778 | 0 |
| 0.8097222222222222 | 0 |
| 0.8104166666666667 | 0 |
| 0.811111111111111 | 0 |
| 0.8118055555555556 | 0 |
| 0.8125 | 0 |
| 0.8131944444444444 | 0 |
| 0.813888888888889 | 0 |
| 0.8145833333333333 | 0 |
| 0.8152777777777778 | 0 |
| 0.8159722222222222 | 0 |
| 0.8166666666666668 | 0 |
| 0.8173611111111111 | 0 |
| 0.8180555555555555 | 0 |
| 0.81875 | 0 |
| 0.8194444444444445 | 0 |
| 0.8201388888888889 | 0 |
| 0.8208333333333333 | 0 |
| 0.8215277777777777 | 0 |
| 0.8222222222222223 | 0 |
| 0.8229166666666666 | 0 |
| 0.8236111111111111 | 0 |
| 0.8243055555555556 | 0 |
| 0.8250000000000001 | 0 |
| 0.8256944444444444 | 0 |
| 0.8263888888888888 | 0 |
| 0.8270833333333334 | 0 |
| 0.8277777777777778 | 0 |
| 0.8284722222222222 | 0 |
| 0.8291666666666666 | 0 |
| 0.8298611111111112 | 0 |
| 0.8305555555555556 | 0 |
| 0.8312499999999999 | 0 |
| 0.8319444444444444 | 0 |
| 0.8326388888888889 | 0 |
| 0.8333333333333334 | 0 |
| 0.8340277777777777 | 0 |
| 0.8347222222222223 | 0 |
| 0.8354166666666667 | 0 |
| 0.8361111111111111 | 0 |
| 0.8368055555555555 | 0 |
| 0.8375 | 0 |
| 0.8381944444444445 | 0 |
| 0.8388888888888889 | 0 |
| 0.8395833333333332 | 0 |
| 0.8402777777777778 | 0 |
| 0.8409722222222222 | 0 |
| 0.8416666666666667 | 0 |
| 0.842361111111111 | 0 |
| 0.8430555555555556 | 0 |
| 0.84375 | 0 |
| 0.8444444444444444 | 0 |
| 0.845138888888889 | 0 |
| 0.8458333333333333 | 0 |
| 0.8465277777777778 | 0 |
| 0.8472222222222222 | 0 |
| 0.8479166666666668 | 0 |
| 0.8486111111111111 | 0 |
| 0.8493055555555555 | 0 |
| 0.85 | 0 |
| 0.8506944444444445 | 0 |
| 0.8513888888888889 | 0 |
| 0.8520833333333333 | 0 |
| 0.8527777777777777 | 0 |
| 0.8534722222222223 | 0 |
| 0.8541666666666666 | 0 |
| 0.8548611111111111 | 0 |
| 0.8555555555555556 | 0 |
| 0.8562500000000001 | 0 |
| 0.8569444444444444 | 0 |
| 0.8576388888888888 | 0 |
| 0.8583333333333334 | 0 |
| 0.8590277777777778 | 0 |
| 0.8597222222222222 | 0 |
| 0.8604166666666666 | 0 |
| 0.8611111111111112 | 0 |
| 0.8618055555555556 | 0 |
| 0.8624999999999999 | 0 |
| 0.8631944444444444 | 0 |
| 0.8638888888888889 | 0 |
| 0.8645833333333334 | 0 |
| 0.8652777777777777 | 0 |
| 0.8659722222222223 | 0 |
| 0.8666666666666667 | 0 |
| 0.8673611111111111 | 0 |
| 0.8680555555555555 | 0 |
| 0.86875 | 0 |
| 0.8694444444444445 | 0 |
| 0.8701388888888889 | 0 |
| 0.8708333333333332 | 0 |
| 0.8715277777777778 | 0 |
| 0.8722222222222222 | 0 |
| 0.8729166666666667 | 0 |
| 0.873611111111111 | 0 |
| 0.8743055555555556 | 0 |
| 0.875 | 0 |
| 0.8756944444444444 | 0 |
| 0.876388888888889 | 0 |
| 0.8770833333333333 | 0 |
| 0.8777777777777778 | 0 |
| 0.8784722222222222 | 0 |
| 0.8791666666666668 | 0 |
| 0.8798611111111111 | 0 |
| 0.8805555555555555 | 0 |
| 0.88125 | 0 |
| 0.8819444444444445 | 0 |
| 0.8826388888888889 | 0 |
| 0.8833333333333333 | 0 |
| 0.8840277777777777 | 0 |
| 0.8847222222222223 | 0 |
| 0.8854166666666666 | 0 |
| 0.8861111111111111 | 0 |
| 0.8868055555555556 | 0 |
| 0.8875000000000001 | 0 |
| 0.8881944444444444 | 0 |
| 0.8888888888888888 | 0 |
| 0.8895833333333334 | 0 |
| 0.8902777777777778 | 0 |
| 0.8909722222222222 | 0 |
| 0.8916666666666666 | 0 |
| 0.8923611111111112 | 0 |
| 0.8930555555555556 | 0 |
| 0.8937499999999999 | 0 |
| 0.8944444444444444 | 0 |
| 0.8951388888888889 | 0 |
| 0.8958333333333334 | 0 |
| 0.8965277777777777 | 0 |
| 0.8972222222222223 | 0 |
| 0.8979166666666667 | 0 |
| 0.8986111111111111 | 0 |
| 0.8993055555555555 | 0 |
| 0.9 | 0 |
| 0.9006944444444445 | 0 |
| 0.9013888888888889 | 0 |
| 0.9020833333333332 | 0 |
| 0.9027777777777778 | 0 |
| 0.9034722222222222 | 0 |
| 0.9041666666666667 | 0 |
| 0.904861111111111 | 0 |
| 0.9055555555555556 | 0 |
| 0.90625 | 0 |
| 0.9069444444444444 | 0 |
| 0.907638888888889 | 0 |
| 0.9083333333333333 | 0 |
| 0.9090277777777778 | 0 |
| 0.9097222222222222 | 0 |
| 0.9104166666666668 | 0 |
| 0.9111111111111111 | 0 |
| 0.9118055555555555 | 0 |
| 0.9125 | 0 |
| 0.9131944444444445 | 0 |
| 0.9138888888888889 | 0 |
| 0.9145833333333333 | 0 |
| 0.9152777777777777 | 0 |
| 0.9159722222222223 | 0 |
| 0.9166666666666666 | 0 |
| 0.9173611111111111 | 0 |
| 0.9180555555555556 | 0 |
| 0.9187500000000001 | 0 |
| 0.9194444444444444 | 0 |
| 0.9201388888888888 | 0 |
| 0.9208333333333334 | 0 |
| 0.9215277777777778 | 0 |
| 0.9222222222222222 | 0 |
| 0.9229166666666666 | 0 |
| 0.9236111111111112 | 0 |
| 0.9243055555555556 | 0 |
| 0.9249999999999999 | 0 |
| 0.9256944444444444 | 0 |
| 0.9263888888888889 | 0 |
| 0.9270833333333334 | 0 |
| 0.9277777777777777 | 0 |
| 0.9284722222222223 | 0 |
| 0.9291666666666667 | 0 |
| 0.9298611111111111 | 0 |
| 0.9305555555555555 | 0 |
| 0.93125 | 0 |
| 0.9319444444444445 | 0 |
| 0.9326388888888889 | 0 |
| 0.9333333333333332 | 0 |
| 0.9340277777777778 | 0 |
| 0.9347222222222222 | 0 |
| 0.9354166666666667 | 0 |
| 0.936111111111111 | 0 |
| 0.9368055555555556 | 0 |
| 0.9375 | 0 |
| 0.9381944444444444 | 0 |
| 0.938888888888889 | 0 |
| 0.9395833333333333 | 0 |
| 0.9402777777777778 | 0 |
| 0.9409722222222222 | 0 |
| 0.9416666666666668 | 0 |
| 0.9423611111111111 | 0 |
| 0.9430555555555555 | 0 |
| 0.94375 | 0 |
| 0.9444444444444445 | 0 |
| 0.9451388888888889 | 0 |
| 0.9458333333333333 | 0 |
| 0.9465277777777777 | 0 |
| 0.9472222222222223 | 0 |
| 0.9479166666666666 | 0 |
| 0.9486111111111111 | 0 |
| 0.9493055555555556 | 0 |
| 0.9500000000000001 | 0 |
| 0.9506944444444444 | 0 |
| 0.9513888888888888 | 0 |
| 0.9520833333333334 | 0 |
| 0.9527777777777778 | 0 |
| 0.9534722222222222 | 0 |
| 0.9541666666666666 | 0 |
| 0.9548611111111112 | 0 |
| 0.9555555555555556 | 0 |
| 0.9562499999999999 | 0 |
| 0.9569444444444444 | 0 |
| 0.9576388888888889 | 0 |
| 0.9583333333333334 | 0 |
| 0.9590277777777777 | 0 |
| 0.9597222222222223 | 0 |
| 0.9604166666666667 | 0 |
| 0.9611111111111111 | 0 |
| 0.9618055555555555 | 0 |
| 0.9625 | 0 |
| 0.9631944444444445 | 0 |
| 0.9638888888888889 | 0 |
| 0.9645833333333332 | 0 |
| 0.9652777777777778 | 0 |
| 0.9659722222222222 | 0 |
| 0.9666666666666667 | 0 |
| 0.967361111111111 | 0 |
| 0.9680555555555556 | 0 |
| 0.96875 | 0 |
| 0.9694444444444444 | 0 |
| 0.970138888888889 | 0 |
| 0.9708333333333333 | 0 |
| 0.9715277777777778 | 0 |
| 0.9722222222222222 | 0 |
| 0.9729166666666668 | 0 |
| 0.9736111111111111 | 0 |
| 0.9743055555555555 | 0 |
| 0.975 | 0 |
| 0.9756944444444445 | 0 |
| 0.9763888888888889 | 0 |
| 0.9770833333333333 | 0 |
| 0.9777777777777777 | 0 |
| 0.9784722222222223 | 0 |
| 0.9791666666666666 | 0 |
| 0.9798611111111111 | 0 |
| 0.9805555555555556 | 0 |
| 0.9812500000000001 | 0 |
| 0.9819444444444444 | 0 |
| 0.9826388888888888 | 0 |
| 0.9833333333333334 | 0 |
| 0.9840277777777778 | 0 |
| 0.9847222222222222 | 0 |
| 0.9854166666666666 | 0 |
| 0.9861111111111112 | 0 |
| 0.9868055555555556 | 0 |
| 0.9874999999999999 | 0 |
| 0.9881944444444444 | 0 |
| 0.9888888888888889 | 0 |
| 0.9895833333333334 | 0 |
| 0.9902777777777777 | 0 |
| 0.9909722222222223 | 0 |
| 0.9916666666666667 | 0 |
| 0.9923611111111111 | 0 |
| 0.9930555555555555 | 0 |
| 0.99375 | 0 |
| 0.9944444444444445 | 0 |
| 0.9951388888888889 | 0 |
| 0.9958333333333332 | 0 |
| 0.9965277777777778 | 0 |
| 0.9972222222222222 | 0 |
| 0.9979166666666667 | 0 |
| 0.998611111111111 | 0 |
| 0.9993055555555556 | 0 |